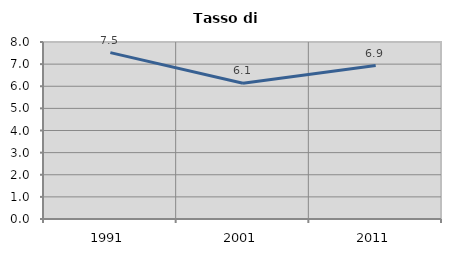
| Category | Tasso di disoccupazione   |
|---|---|
| 1991.0 | 7.519 |
| 2001.0 | 6.135 |
| 2011.0 | 6.936 |